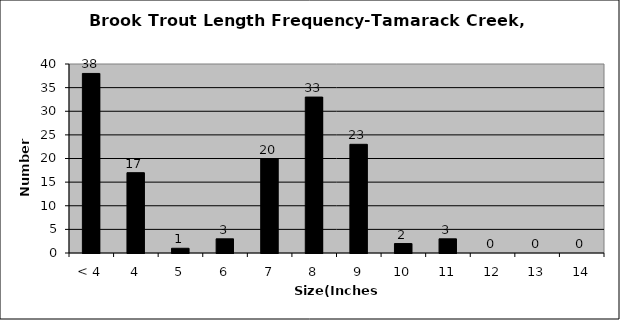
| Category | Series 0 |
|---|---|
| < 4 | 38 |
| 4 | 17 |
| 5 | 1 |
| 6 | 3 |
| 7 | 20 |
| 8 | 33 |
| 9 | 23 |
| 10 | 2 |
| 11 | 3 |
| 12 | 0 |
| 13 | 0 |
| 14 | 0 |